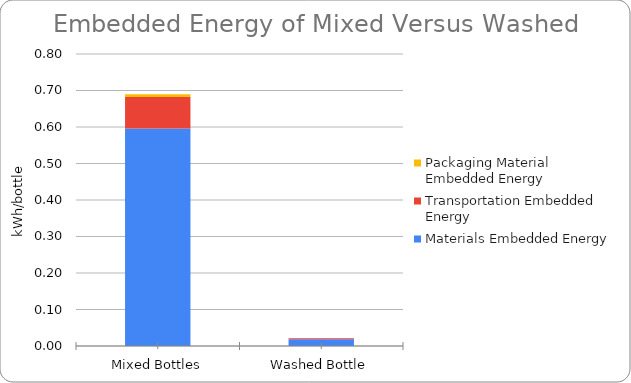
| Category | Materials Embedded Energy | Transportation Embedded Energy | Packaging Material Embedded Energy |
|---|---|---|---|
| Mixed Bottles | 0.596 | 0.086 | 0.007 |
| Washed Bottle | 0.019 | 0.002 | 0 |